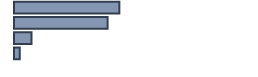
| Category | Percentatge |
|---|---|
| 0 | 43.9 |
| 1 | 39 |
| 2 | 7.3 |
| 3 | 2.4 |